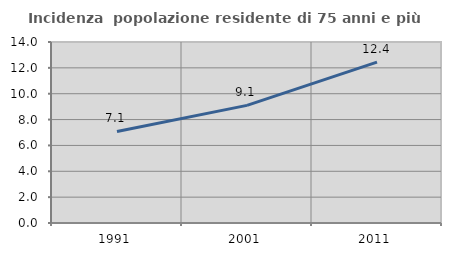
| Category | Incidenza  popolazione residente di 75 anni e più |
|---|---|
| 1991.0 | 7.082 |
| 2001.0 | 9.096 |
| 2011.0 | 12.449 |